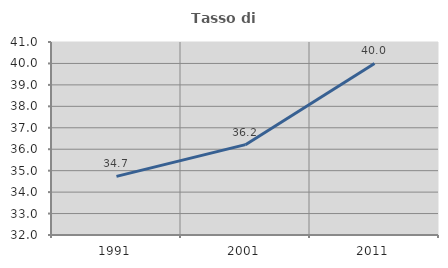
| Category | Tasso di occupazione   |
|---|---|
| 1991.0 | 34.735 |
| 2001.0 | 36.213 |
| 2011.0 | 40 |